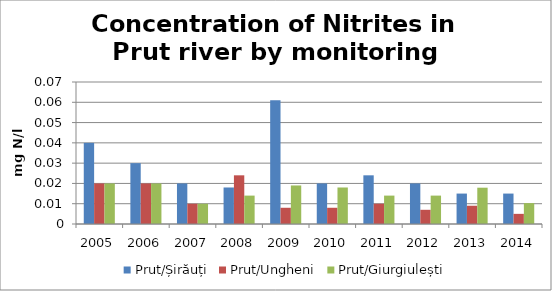
| Category | Prut/Șirăuți | Prut/Ungheni | Prut/Giurgiulești |
|---|---|---|---|
| 2005.0 | 0.04 | 0.02 | 0.02 |
| 2006.0 | 0.03 | 0.02 | 0.02 |
| 2007.0 | 0.02 | 0.01 | 0.01 |
| 2008.0 | 0.018 | 0.024 | 0.014 |
| 2009.0 | 0.061 | 0.008 | 0.019 |
| 2010.0 | 0.02 | 0.008 | 0.018 |
| 2011.0 | 0.024 | 0.01 | 0.014 |
| 2012.0 | 0.02 | 0.007 | 0.014 |
| 2013.0 | 0.015 | 0.009 | 0.018 |
| 2014.0 | 0.015 | 0.005 | 0.01 |